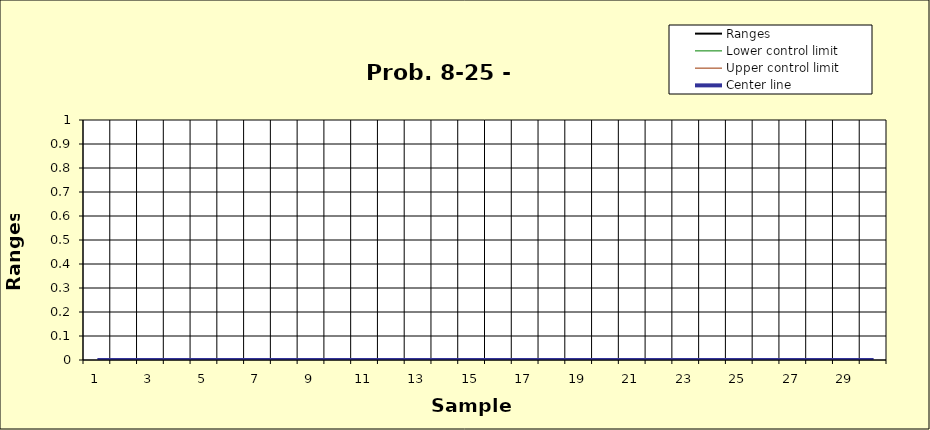
| Category | Ranges | Lower control limit | Upper control limit | Center line |
|---|---|---|---|---|
| 0 |  |  |  | 0 |
| 1 |  |  |  | 0 |
| 2 |  |  |  | 0 |
| 3 |  |  |  | 0 |
| 4 |  |  |  | 0 |
| 5 |  |  |  | 0 |
| 6 |  |  |  | 0 |
| 7 |  |  |  | 0 |
| 8 |  |  |  | 0 |
| 9 |  |  |  | 0 |
| 10 |  |  |  | 0 |
| 11 |  |  |  | 0 |
| 12 |  |  |  | 0 |
| 13 |  |  |  | 0 |
| 14 |  |  |  | 0 |
| 15 |  |  |  | 0 |
| 16 |  |  |  | 0 |
| 17 |  |  |  | 0 |
| 18 |  |  |  | 0 |
| 19 |  |  |  | 0 |
| 20 |  |  |  | 0 |
| 21 |  |  |  | 0 |
| 22 |  |  |  | 0 |
| 23 |  |  |  | 0 |
| 24 |  |  |  | 0 |
| 25 |  |  |  | 0 |
| 26 |  |  |  | 0 |
| 27 |  |  |  | 0 |
| 28 |  |  |  | 0 |
| 29 |  |  |  | 0 |